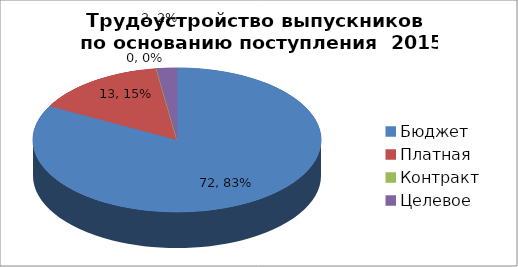
| Category | Series 0 |
|---|---|
| Бюджет | 72 |
| Платная | 13 |
| Контракт | 0 |
| Целевое | 2 |